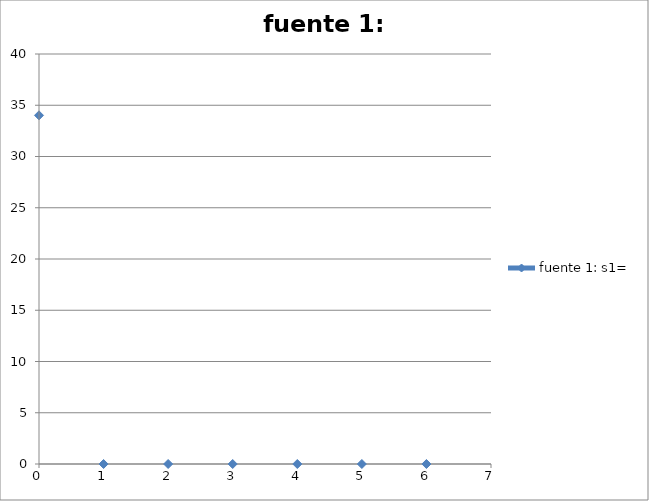
| Category | fuente 1: s1= |
|---|---|
| 0.0 | 34.018 |
| 1.0 | 0 |
| 2.0 | 0 |
| 3.0 | 0 |
| 4.0 | 0 |
| 5.0 | 0 |
| 6.0 | 0 |